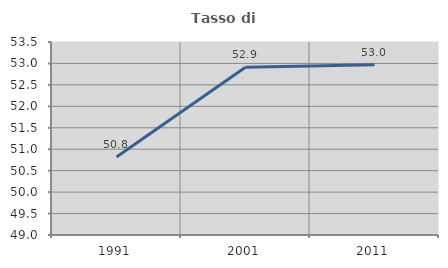
| Category | Tasso di occupazione   |
|---|---|
| 1991.0 | 50.817 |
| 2001.0 | 52.914 |
| 2011.0 | 52.971 |